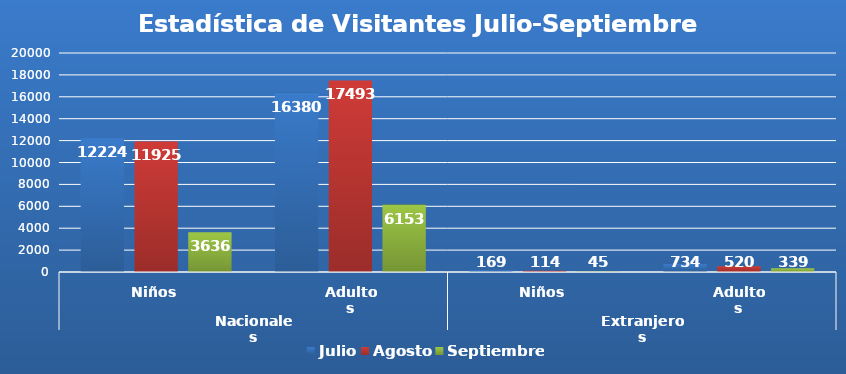
| Category | Julio | Agosto | Septiembre |
|---|---|---|---|
| 0 | 12224 | 11925 | 3636 |
| 1 | 16380 | 17493 | 6153 |
| 2 | 169 | 114 | 45 |
| 3 | 734 | 520 | 339 |